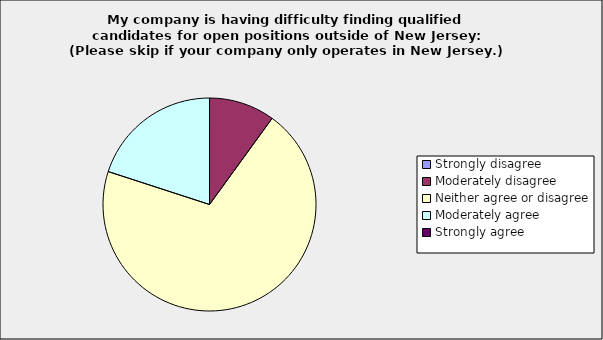
| Category | Series 0 |
|---|---|
| Strongly disagree | 0 |
| Moderately disagree | 0.1 |
| Neither agree or disagree | 0.7 |
| Moderately agree | 0.2 |
| Strongly agree | 0 |